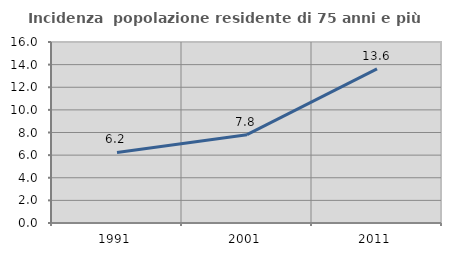
| Category | Incidenza  popolazione residente di 75 anni e più |
|---|---|
| 1991.0 | 6.237 |
| 2001.0 | 7.805 |
| 2011.0 | 13.625 |